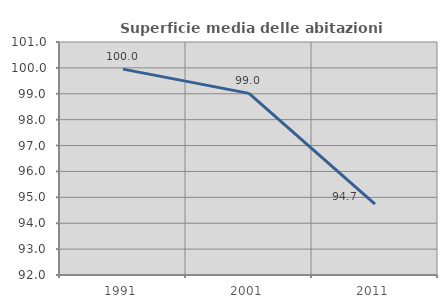
| Category | Superficie media delle abitazioni occupate |
|---|---|
| 1991.0 | 99.953 |
| 2001.0 | 99.015 |
| 2011.0 | 94.741 |